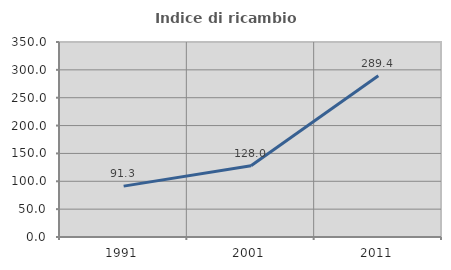
| Category | Indice di ricambio occupazionale  |
|---|---|
| 1991.0 | 91.304 |
| 2001.0 | 127.95 |
| 2011.0 | 289.412 |